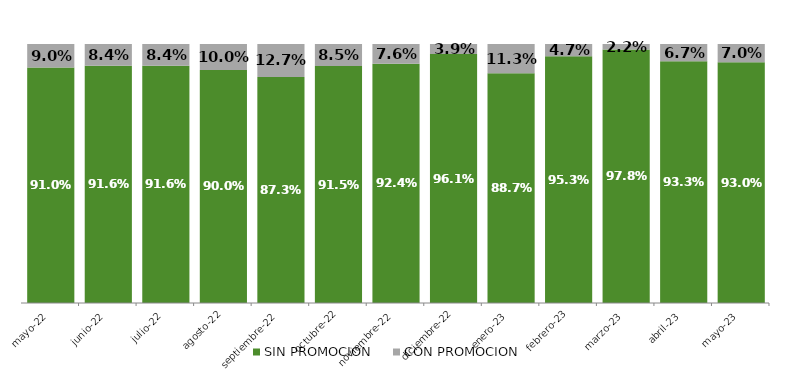
| Category | SIN PROMOCION   | CON PROMOCION   |
|---|---|---|
| 2022-05-01 | 0.91 | 0.09 |
| 2022-06-01 | 0.916 | 0.084 |
| 2022-07-01 | 0.916 | 0.084 |
| 2022-08-01 | 0.9 | 0.1 |
| 2022-09-01 | 0.873 | 0.127 |
| 2022-10-01 | 0.915 | 0.085 |
| 2022-11-01 | 0.924 | 0.076 |
| 2022-12-01 | 0.961 | 0.039 |
| 2023-01-01 | 0.887 | 0.113 |
| 2023-02-01 | 0.953 | 0.047 |
| 2023-03-01 | 0.978 | 0.022 |
| 2023-04-01 | 0.933 | 0.067 |
| 2023-05-01 | 0.93 | 0.07 |